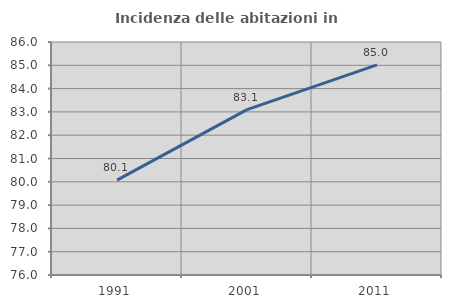
| Category | Incidenza delle abitazioni in proprietà  |
|---|---|
| 1991.0 | 80.07 |
| 2001.0 | 83.096 |
| 2011.0 | 85.019 |